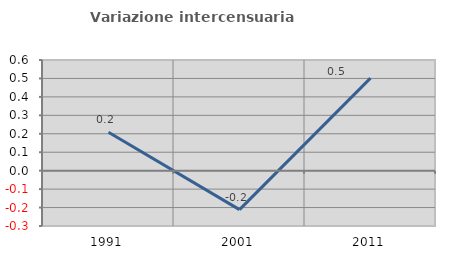
| Category | Variazione intercensuaria annua |
|---|---|
| 1991.0 | 0.208 |
| 2001.0 | -0.211 |
| 2011.0 | 0.502 |